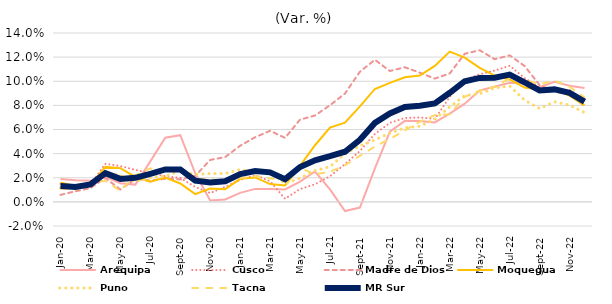
| Category | Arequipa | Cusco | Madre de Dios | Moquegua | Puno | Tacna | MR Sur |
|---|---|---|---|---|---|---|---|
| 2020-01-01 | 0.019 | 0.015 | 0.006 | 0.016 | 0.012 | 0.011 | 0.013 |
| 2020-02-01 | 0.018 | 0.012 | 0.009 | 0.013 | 0.012 | 0.01 | 0.012 |
| 2020-03-01 | 0.018 | 0.014 | 0.011 | 0.014 | 0.014 | 0.016 | 0.015 |
| 2020-04-01 | 0.021 | 0.032 | 0.02 | 0.029 | 0.024 | 0.017 | 0.024 |
| 2020-05-01 | 0.015 | 0.03 | 0.01 | 0.028 | 0.022 | 0.009 | 0.019 |
| 2020-06-01 | 0.014 | 0.027 | 0.019 | 0.021 | 0.017 | 0.022 | 0.02 |
| 2020-07-01 | 0.034 | 0.024 | 0.018 | 0.017 | 0.02 | 0.028 | 0.023 |
| 2020-08-01 | 0.053 | 0.021 | 0.019 | 0.02 | 0.021 | 0.026 | 0.027 |
| 2020-09-01 | 0.055 | 0.02 | 0.019 | 0.015 | 0.026 | 0.027 | 0.027 |
| 2020-10-01 | 0.024 | 0.012 | 0.022 | 0.006 | 0.023 | 0.019 | 0.018 |
| 2020-11-01 | 0.001 | 0.007 | 0.035 | 0.011 | 0.023 | 0.019 | 0.016 |
| 2020-12-01 | 0.002 | 0.012 | 0.037 | 0.01 | 0.024 | 0.017 | 0.017 |
| 2021-01-01 | 0.008 | 0.018 | 0.047 | 0.019 | 0.027 | 0.02 | 0.023 |
| 2021-02-01 | 0.011 | 0.022 | 0.054 | 0.02 | 0.025 | 0.021 | 0.025 |
| 2021-03-01 | 0.011 | 0.017 | 0.059 | 0.015 | 0.026 | 0.019 | 0.024 |
| 2021-04-01 | 0.01 | 0.003 | 0.053 | 0.014 | 0.015 | 0.018 | 0.019 |
| 2021-05-01 | 0.017 | 0.011 | 0.068 | 0.03 | 0.02 | 0.028 | 0.029 |
| 2021-06-01 | 0.025 | 0.015 | 0.072 | 0.047 | 0.026 | 0.023 | 0.035 |
| 2021-07-01 | 0.01 | 0.021 | 0.08 | 0.062 | 0.029 | 0.025 | 0.038 |
| 2021-08-01 | -0.008 | 0.031 | 0.09 | 0.066 | 0.04 | 0.03 | 0.042 |
| 2021-09-01 | -0.005 | 0.042 | 0.108 | 0.079 | 0.046 | 0.038 | 0.052 |
| 2021-10-01 | 0.028 | 0.056 | 0.118 | 0.094 | 0.051 | 0.046 | 0.065 |
| 2021-11-01 | 0.058 | 0.065 | 0.108 | 0.099 | 0.057 | 0.052 | 0.073 |
| 2021-12-01 | 0.067 | 0.07 | 0.112 | 0.103 | 0.061 | 0.059 | 0.079 |
| 2022-01-01 | 0.067 | 0.07 | 0.107 | 0.105 | 0.063 | 0.067 | 0.08 |
| 2022-02-01 | 0.066 | 0.069 | 0.102 | 0.113 | 0.068 | 0.072 | 0.082 |
| 2022-03-01 | 0.073 | 0.087 | 0.106 | 0.125 | 0.079 | 0.073 | 0.09 |
| 2022-04-01 | 0.081 | 0.101 | 0.123 | 0.12 | 0.088 | 0.087 | 0.1 |
| 2022-05-01 | 0.092 | 0.106 | 0.126 | 0.111 | 0.09 | 0.092 | 0.103 |
| 2022-06-01 | 0.095 | 0.109 | 0.118 | 0.105 | 0.094 | 0.096 | 0.103 |
| 2022-07-01 | 0.099 | 0.113 | 0.121 | 0.102 | 0.096 | 0.102 | 0.105 |
| 2022-08-01 | 0.098 | 0.103 | 0.113 | 0.095 | 0.084 | 0.102 | 0.099 |
| 2022-09-01 | 0.095 | 0.095 | 0.097 | 0.093 | 0.077 | 0.097 | 0.092 |
| 2022-10-01 | 0.1 | 0.092 | 0.092 | 0.093 | 0.083 | 0.1 | 0.093 |
| 2022-11-01 | 0.096 | 0.093 | 0.089 | 0.088 | 0.08 | 0.096 | 0.09 |
| 2022-12-01 | 0.094 | 0.084 | 0.08 | 0.08 | 0.074 | 0.086 | 0.083 |